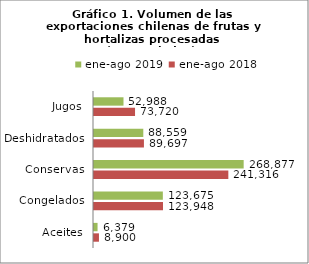
| Category | ene-ago 2018 | ene-ago 2019 |
|---|---|---|
| Aceites | 8899988.085 | 6379186.903 |
| Congelados | 123947726.19 | 123674520.926 |
| Conservas | 241316123.743 | 268877019.007 |
| Deshidratados | 89696814.187 | 88558898.82 |
| Jugos | 73719843.892 | 52987908.845 |